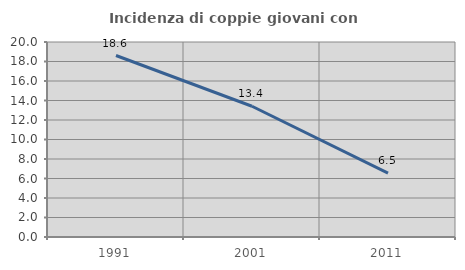
| Category | Incidenza di coppie giovani con figli |
|---|---|
| 1991.0 | 18.614 |
| 2001.0 | 13.411 |
| 2011.0 | 6.543 |